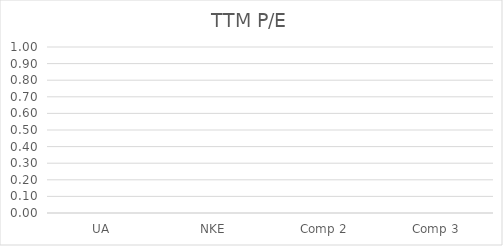
| Category | TTM P/E |
|---|---|
| UA | 0 |
| NKE | 0 |
| Comp 2 | 0 |
| Comp 3 | 0 |